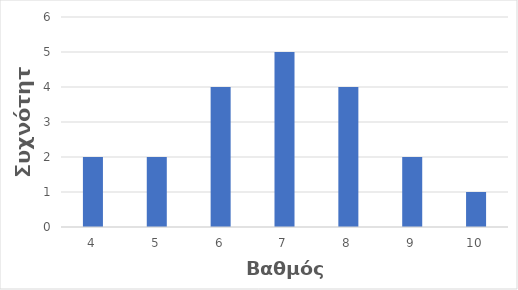
| Category | Συχνότητα |
|---|---|
| 4.0 | 2 |
| 5.0 | 2 |
| 6.0 | 4 |
| 7.0 | 5 |
| 8.0 | 4 |
| 9.0 | 2 |
| 10.0 | 1 |